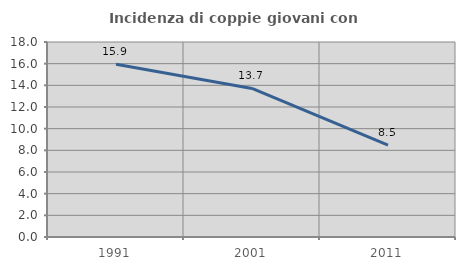
| Category | Incidenza di coppie giovani con figli |
|---|---|
| 1991.0 | 15.942 |
| 2001.0 | 13.712 |
| 2011.0 | 8.485 |